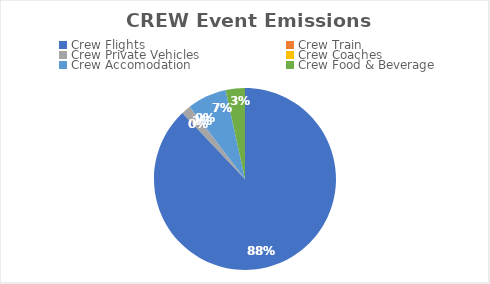
| Category | Series 0 |
|---|---|
| Crew Flights | 8.46 |
| Crew Train | 0 |
| Crew Private Vehicles | 0.16 |
| Crew Coaches | 0 |
| Crew Accomodation | 0.67 |
| Crew Food & Beverage | 0.33 |